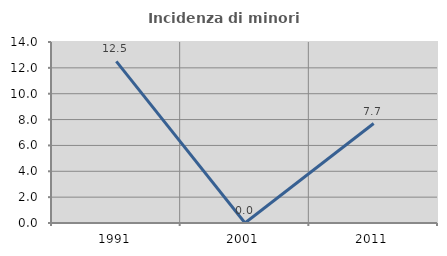
| Category | Incidenza di minori stranieri |
|---|---|
| 1991.0 | 12.5 |
| 2001.0 | 0 |
| 2011.0 | 7.692 |